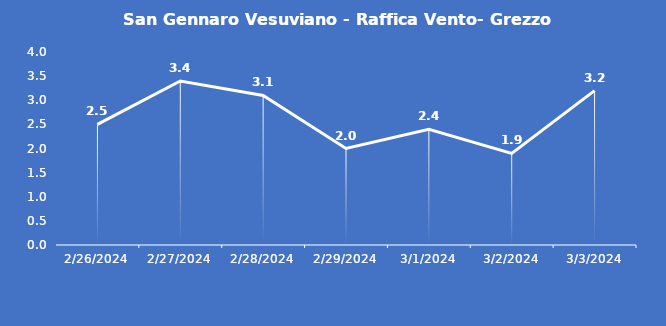
| Category | San Gennaro Vesuviano - Raffica Vento- Grezzo (m/s) |
|---|---|
| 2/26/24 | 2.5 |
| 2/27/24 | 3.4 |
| 2/28/24 | 3.1 |
| 2/29/24 | 2 |
| 3/1/24 | 2.4 |
| 3/2/24 | 1.9 |
| 3/3/24 | 3.2 |